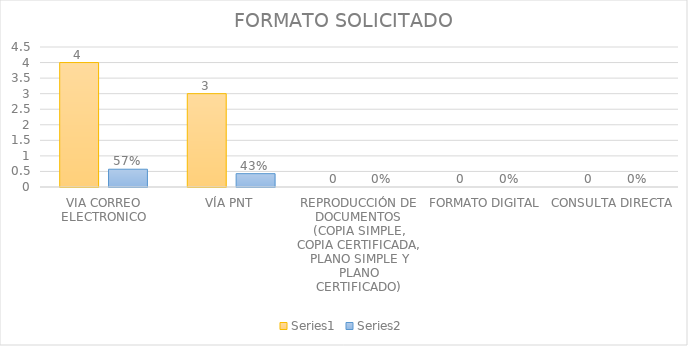
| Category | Series 3 | Series 4 |
|---|---|---|
| VIA CORREO ELECTRONICO | 4 | 0.571 |
| VÍA PNT | 3 | 0.429 |
| REPRODUCCIÓN DE DOCUMENTOS (COPIA SIMPLE, COPIA CERTIFICADA, PLANO SIMPLE Y PLANO CERTIFICADO) | 0 | 0 |
| FORMATO DIGITAL | 0 | 0 |
| CONSULTA DIRECTA | 0 | 0 |